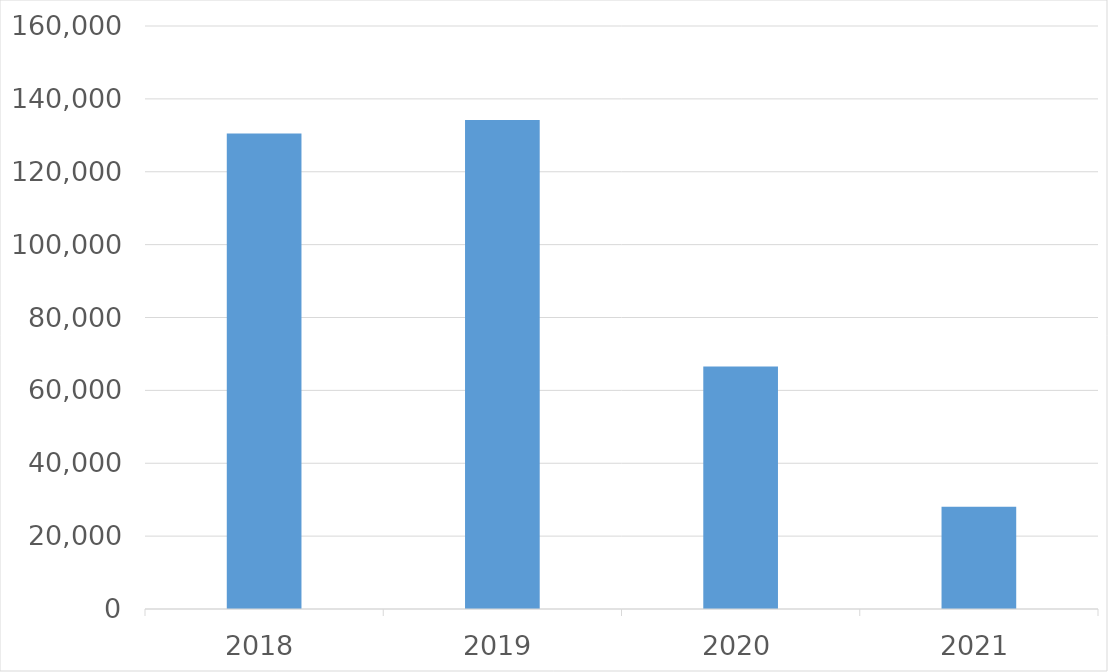
| Category | Series 0 |
|---|---|
| 2018 | 130515 |
| 2019 | 134200 |
| 2020 | 66586 |
| 2021 | 28043 |